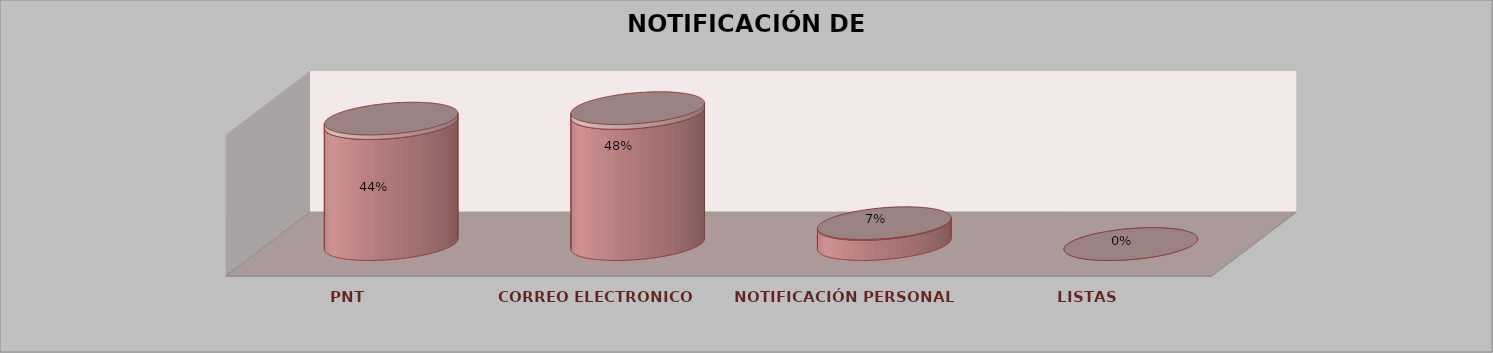
| Category | Series 0 | Series 1 | Series 2 | Series 3 | Series 4 |
|---|---|---|---|---|---|
| PNT |  |  |  | 12 | 0.444 |
| CORREO ELECTRONICO |  |  |  | 13 | 0.481 |
| NOTIFICACIÓN PERSONAL |  |  |  | 2 | 0.074 |
| LISTAS |  |  |  | 0 | 0 |